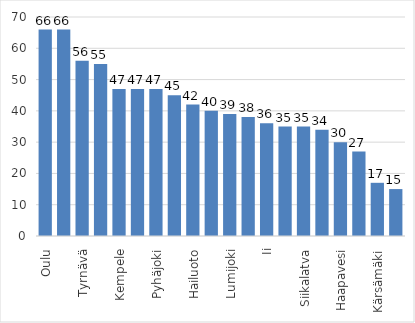
| Category | Series 0 |
|---|---|
| Oulu | 66 |
| Raahe | 66 |
| Tyrnävä | 56 |
| Siikajoki | 55 |
| Kempele | 47 |
| Liminka | 47 |
| Pyhäjoki | 47 |
| Oulainen | 45 |
| Hailuoto | 42 |
| Muhos | 40 |
| Lumijoki | 39 |
| Taivalkoski | 38 |
| Ii | 36 |
| Pudasjärvi | 35 |
| Siikalatva | 35 |
| Utajärvi | 34 |
| Haapavesi | 30 |
| Merijärvi | 27 |
| Kärsämäki | 17 |
| Pyhäntä | 15 |